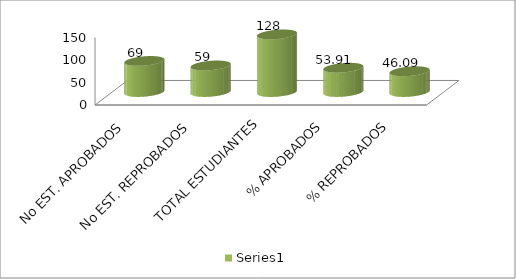
| Category | Series 0 |
|---|---|
| No EST. APROBADOS | 69 |
| No EST. REPROBADOS | 59 |
| TOTAL ESTUDIANTES | 128 |
| % APROBADOS | 53.906 |
| % REPROBADOS | 46.094 |